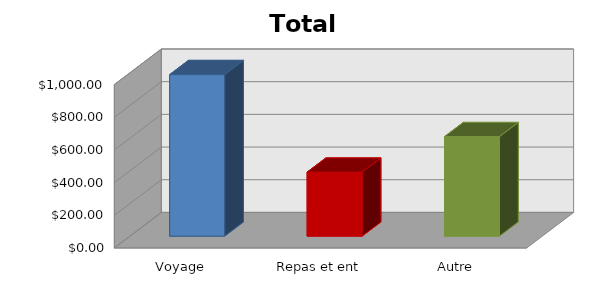
| Category | Series 0 |
|---|---|
| Voyage | 988.4 |
| Repas et ent | 391.54 |
| Autre | 609 |